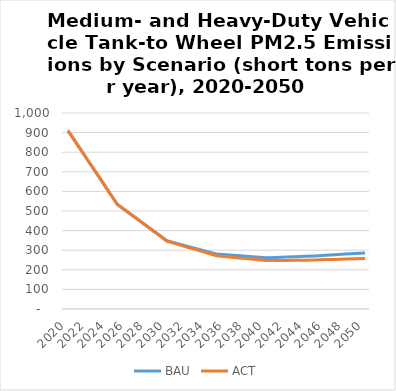
| Category | BAU | ACT |
|---|---|---|
| 2020.0 | 910 | 910 |
| 2021.0 | 835 | 835 |
| 2022.0 | 759 | 759 |
| 2023.0 | 684 | 684 |
| 2024.0 | 608 | 608 |
| 2025.0 | 533 | 533 |
| 2026.0 | 496 | 496 |
| 2027.0 | 459 | 459 |
| 2028.0 | 422 | 421 |
| 2029.0 | 385 | 384 |
| 2030.0 | 348 | 346 |
| 2031.0 | 335 | 331 |
| 2032.0 | 321 | 316 |
| 2033.0 | 308 | 302 |
| 2034.0 | 294 | 287 |
| 2035.0 | 281 | 272 |
| 2036.0 | 277 | 267 |
| 2037.0 | 273 | 262 |
| 2038.0 | 269 | 257 |
| 2039.0 | 265 | 252 |
| 2040.0 | 261 | 247 |
| 2041.0 | 263 | 248 |
| 2042.0 | 265 | 248 |
| 2043.0 | 267 | 249 |
| 2044.0 | 269 | 249 |
| 2045.0 | 271 | 250 |
| 2046.0 | 274 | 252 |
| 2047.0 | 277 | 253 |
| 2048.0 | 280 | 255 |
| 2049.0 | 283 | 256 |
| 2050.0 | 286 | 258 |